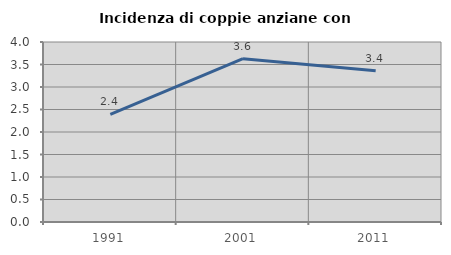
| Category | Incidenza di coppie anziane con figli |
|---|---|
| 1991.0 | 2.392 |
| 2001.0 | 3.629 |
| 2011.0 | 3.362 |